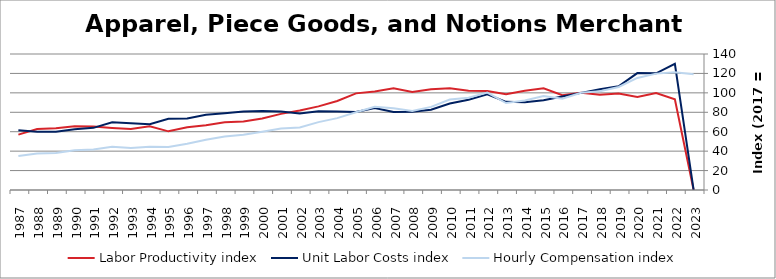
| Category | Labor Productivity index | Unit Labor Costs index | Hourly Compensation index |
|---|---|---|---|
| 2023.0 | 0 | 0 | 119.226 |
| 2022.0 | 93.335 | 129.918 | 121.259 |
| 2021.0 | 99.718 | 120.141 | 119.802 |
| 2020.0 | 95.84 | 120.357 | 115.35 |
| 2019.0 | 99.303 | 106.818 | 106.074 |
| 2018.0 | 97.944 | 103.786 | 101.652 |
| 2017.0 | 100 | 100 | 100 |
| 2016.0 | 97.618 | 96.271 | 93.978 |
| 2015.0 | 104.636 | 92.479 | 96.766 |
| 2014.0 | 102.182 | 90.261 | 92.231 |
| 2013.0 | 98.649 | 90.758 | 89.531 |
| 2012.0 | 101.837 | 98.539 | 100.349 |
| 2011.0 | 102.098 | 92.979 | 94.93 |
| 2010.0 | 104.695 | 88.953 | 93.13 |
| 2009.0 | 103.631 | 82.596 | 85.594 |
| 2008.0 | 100.782 | 80.665 | 81.296 |
| 2007.0 | 104.654 | 80.378 | 84.118 |
| 2006.0 | 101.493 | 84.499 | 85.761 |
| 2005.0 | 99.486 | 80.405 | 79.992 |
| 2004.0 | 91.647 | 80.717 | 73.975 |
| 2003.0 | 86.069 | 81.159 | 69.853 |
| 2002.0 | 81.853 | 78.686 | 64.406 |
| 2001.0 | 78.357 | 80.919 | 63.406 |
| 2000.0 | 73.631 | 81.451 | 59.974 |
| 1999.0 | 70.478 | 80.776 | 56.929 |
| 1998.0 | 69.847 | 78.995 | 55.176 |
| 1997.0 | 66.774 | 77.528 | 51.769 |
| 1996.0 | 64.667 | 73.661 | 47.635 |
| 1995.0 | 60.383 | 73.375 | 44.306 |
| 1994.0 | 65.59 | 67.81 | 44.477 |
| 1993.0 | 62.866 | 68.653 | 43.16 |
| 1992.0 | 63.876 | 69.759 | 44.559 |
| 1991.0 | 65.259 | 63.992 | 41.76 |
| 1990.0 | 65.504 | 62.415 | 40.885 |
| 1989.0 | 63.477 | 59.95 | 38.054 |
| 1988.0 | 62.776 | 60.014 | 37.675 |
| 1987.0 | 56.988 | 61.527 | 35.063 |